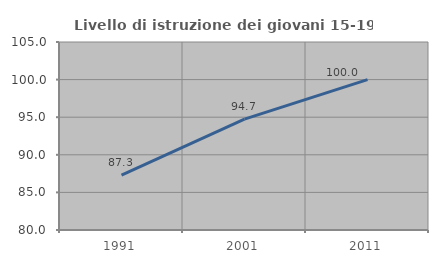
| Category | Livello di istruzione dei giovani 15-19 anni |
|---|---|
| 1991.0 | 87.302 |
| 2001.0 | 94.737 |
| 2011.0 | 100 |